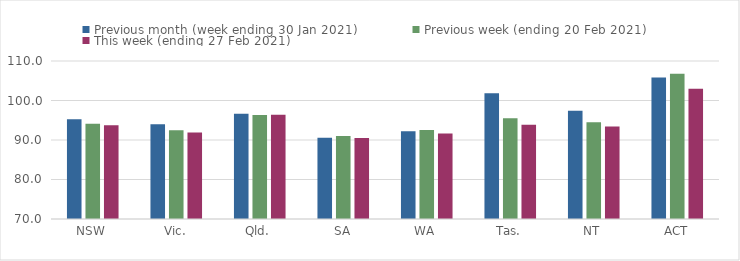
| Category | Previous month (week ending 30 Jan 2021) | Previous week (ending 20 Feb 2021) | This week (ending 27 Feb 2021) |
|---|---|---|---|
| NSW | 95.25 | 94.12 | 93.74 |
| Vic. | 93.99 | 92.47 | 91.89 |
| Qld. | 96.64 | 96.33 | 96.38 |
| SA | 90.58 | 91.01 | 90.48 |
| WA | 92.21 | 92.51 | 91.66 |
| Tas. | 101.85 | 95.52 | 93.86 |
| NT | 97.42 | 94.5 | 93.41 |
| ACT | 105.8 | 106.76 | 102.95 |